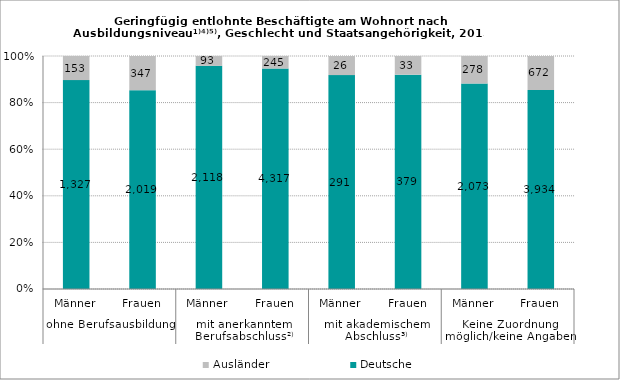
| Category | Deutsche | Ausländer |
|---|---|---|
| 0 | 1327 | 153 |
| 1 | 2019 | 347 |
| 2 | 2118 | 93 |
| 3 | 4317 | 245 |
| 4 | 291 | 26 |
| 5 | 379 | 33 |
| 6 | 2073 | 278 |
| 7 | 3934 | 672 |